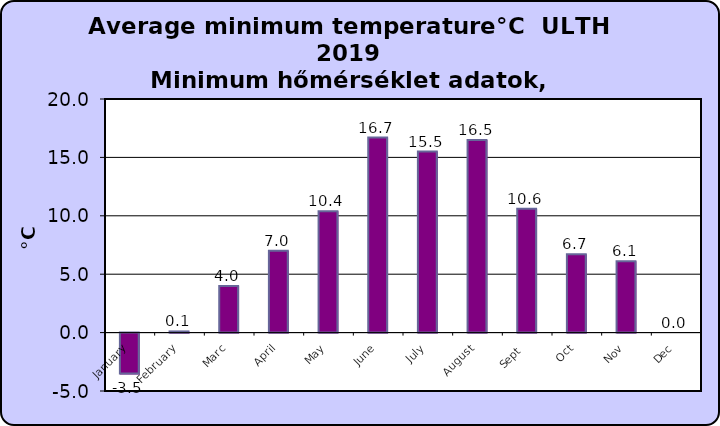
| Category | Series 0 |
|---|---|
| January | -3.5 |
| February | 0.1 |
| Marc | 4 |
| April | 7 |
| May | 10.4 |
| June | 16.7 |
| July | 15.5 |
| August | 16.5 |
| Sept  | 10.6 |
| Oct | 6.7 |
| Nov | 6.1 |
| Dec | 0 |